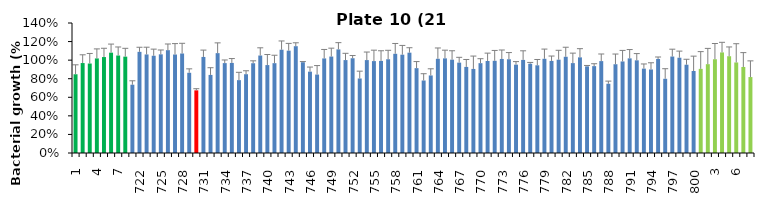
| Category | 21 h % |
|---|---|
| 1.0 | 0.848 |
| 2.0 | 0.969 |
| 3.0 | 0.964 |
| 4.0 | 1.019 |
| 5.0 | 1.033 |
| 6.0 | 1.081 |
| 7.0 | 1.05 |
| 8.0 | 1.038 |
| 721.0 | 0.735 |
| 722.0 | 1.089 |
| 723.0 | 1.061 |
| 724.0 | 1.047 |
| 725.0 | 1.063 |
| 726.0 | 1.107 |
| 727.0 | 1.061 |
| 728.0 | 1.072 |
| 729.0 | 0.864 |
| 730.0 | 0.675 |
| 731.0 | 1.035 |
| 732.0 | 0.841 |
| 733.0 | 1.075 |
| 734.0 | 0.968 |
| 735.0 | 0.97 |
| 736.0 | 0.785 |
| 737.0 | 0.849 |
| 738.0 | 0.967 |
| 739.0 | 1.05 |
| 740.0 | 0.947 |
| 741.0 | 0.967 |
| 742.0 | 1.112 |
| 743.0 | 1.102 |
| 744.0 | 1.15 |
| 745.0 | 0.978 |
| 746.0 | 0.876 |
| 747.0 | 0.845 |
| 748.0 | 1.019 |
| 749.0 | 1.039 |
| 750.0 | 1.116 |
| 751.0 | 1.001 |
| 752.0 | 1.02 |
| 753.0 | 0.803 |
| 754.0 | 1.001 |
| 755.0 | 0.99 |
| 756.0 | 0.992 |
| 757.0 | 1.01 |
| 758.0 | 1.068 |
| 759.0 | 1.059 |
| 760.0 | 1.081 |
| 761.0 | 0.914 |
| 762.0 | 0.781 |
| 763.0 | 0.835 |
| 764.0 | 1.015 |
| 765.0 | 1.019 |
| 766.0 | 1.005 |
| 767.0 | 0.973 |
| 768.0 | 0.927 |
| 769.0 | 0.905 |
| 770.0 | 0.967 |
| 771.0 | 0.991 |
| 772.0 | 0.993 |
| 773.0 | 1.013 |
| 774.0 | 1.01 |
| 775.0 | 0.951 |
| 776.0 | 1.003 |
| 777.0 | 0.961 |
| 778.0 | 0.944 |
| 779.0 | 1.015 |
| 780.0 | 0.992 |
| 781.0 | 1.005 |
| 782.0 | 1.036 |
| 783.0 | 0.968 |
| 784.0 | 1.03 |
| 785.0 | 0.933 |
| 786.0 | 0.935 |
| 787.0 | 0.99 |
| 788.0 | 0.746 |
| 789.0 | 0.956 |
| 790.0 | 0.986 |
| 791.0 | 1.019 |
| 792.0 | 0.998 |
| 793.0 | 0.909 |
| 794.0 | 0.9 |
| 795.0 | 1.013 |
| 796.0 | 0.799 |
| 797.0 | 1.039 |
| 798.0 | 1.026 |
| 799.0 | 0.951 |
| 800.0 | 0.883 |
| 1.0 | 0.906 |
| 2.0 | 0.957 |
| 3.0 | 1.01 |
| 4.0 | 1.083 |
| 5.0 | 1.042 |
| 6.0 | 0.975 |
| 7.0 | 0.927 |
| 8.0 | 0.818 |